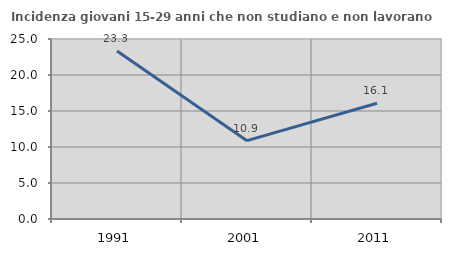
| Category | Incidenza giovani 15-29 anni che non studiano e non lavorano  |
|---|---|
| 1991.0 | 23.331 |
| 2001.0 | 10.88 |
| 2011.0 | 16.077 |